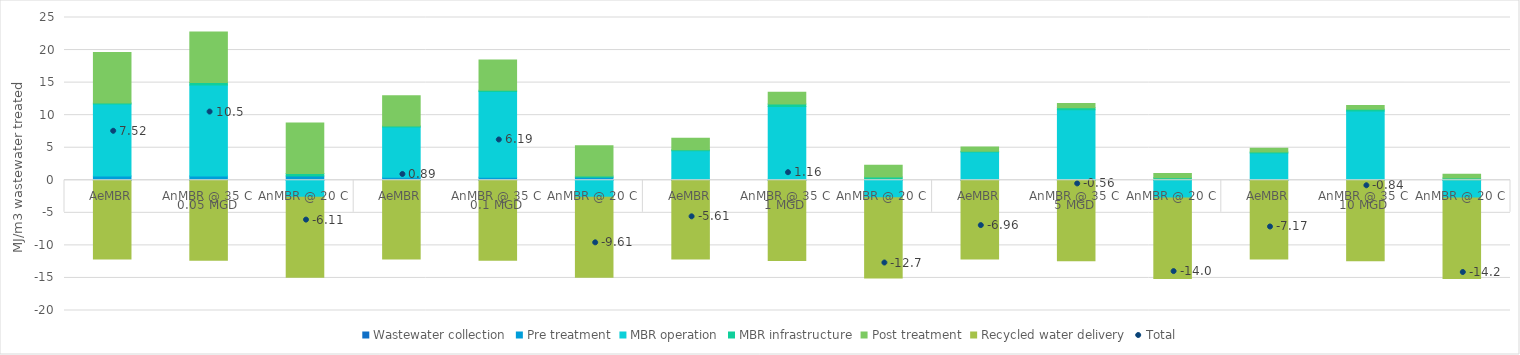
| Category | Wastewater collection | Pre treatment | MBR operation | MBR infrastructure | Post treatment | Recycled water delivery |
|---|---|---|---|---|---|---|
| 0 | 0.003 | 0.65 | 11.057 | 0.161 | 7.739 | -12.085 |
| 1 | 0.003 | 0.65 | 13.985 | 0.387 | 7.739 | -12.284 |
| 2 | 0.003 | 0.65 | -2.609 | 0.387 | 7.739 | -12.284 |
| 3 | 0.003 | 0.452 | 7.726 | 0.15 | 4.643 | -12.085 |
| 4 | 0.003 | 0.452 | 13.186 | 0.199 | 4.643 | -12.295 |
| 5 | 0.003 | 0.452 | -2.609 | 0.199 | 4.643 | -12.295 |
| 6 | 0.003 | 0.143 | 4.393 | 0.139 | 1.794 | -12.085 |
| 7 | 0.003 | 0.143 | 11.187 | 0.375 | 1.794 | -12.337 |
| 8 | 0.003 | 0.143 | -2.683 | 0.375 | 1.794 | -12.337 |
| 9 | 0.003 | 0.07 | 4.27 | 0.124 | 0.658 | -12.085 |
| 10 | 0.003 | 0.07 | 10.751 | 0.313 | 0.658 | -12.35 |
| 11 | 0.003 | 0.07 | -2.718 | 0.313 | 0.658 | -12.35 |
| 12 | 0.003 | 0.053 | 4.151 | 0.123 | 0.58 | -12.085 |
| 13 | 0.003 | 0.053 | 10.585 | 0.281 | 0.58 | -12.346 |
| 14 | 0.003 | 0.053 | -2.736 | 0.281 | 0.58 | -12.346 |